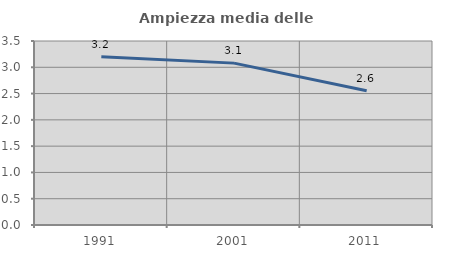
| Category | Ampiezza media delle famiglie |
|---|---|
| 1991.0 | 3.201 |
| 2001.0 | 3.079 |
| 2011.0 | 2.552 |